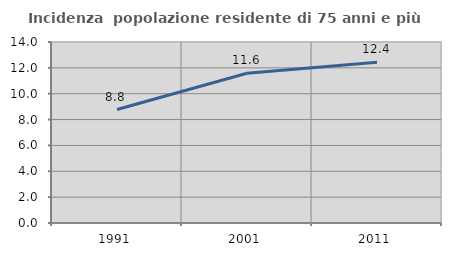
| Category | Incidenza  popolazione residente di 75 anni e più |
|---|---|
| 1991.0 | 8.778 |
| 2001.0 | 11.584 |
| 2011.0 | 12.426 |